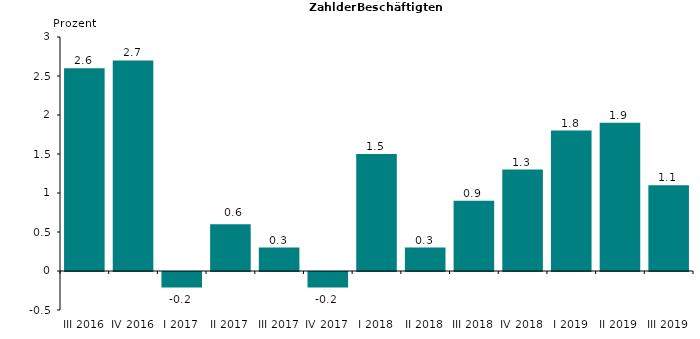
| Category | 2,6 |
|---|---|
| III 2016 | 2.6 |
| IV 2016 | 2.7 |
| I 2017 | -0.2 |
| II 2017 | 0.6 |
| III 2017 | 0.3 |
| IV 2017 | -0.2 |
| I 2018 | 1.5 |
| II 2018 | 0.3 |
| III 2018 | 0.9 |
| IV 2018 | 1.3 |
| I 2019 | 1.8 |
| II 2019 | 1.9 |
| III 2019 | 1.1 |